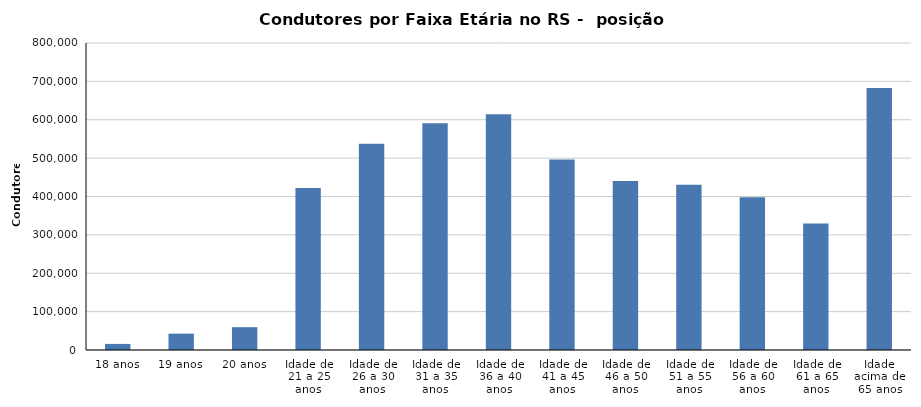
| Category | Condutores |
|---|---|
| 18 anos | 15838 |
| 19 anos | 42608 |
| 20 anos | 59476 |
| Idade de 21 a 25 anos | 422175 |
| Idade de 26 a 30 anos | 537303 |
| Idade de 31 a 35 anos | 590720 |
| Idade de 36 a 40 anos | 614530 |
| Idade de 41 a 45 anos | 496363 |
| Idade de 46 a 50 anos | 440697 |
| Idade de 51 a 55 anos | 430832 |
| Idade de 56 a 60 anos | 398185 |
| Idade de 61 a 65 anos | 329721 |
| Idade acima de 65 anos | 682917 |